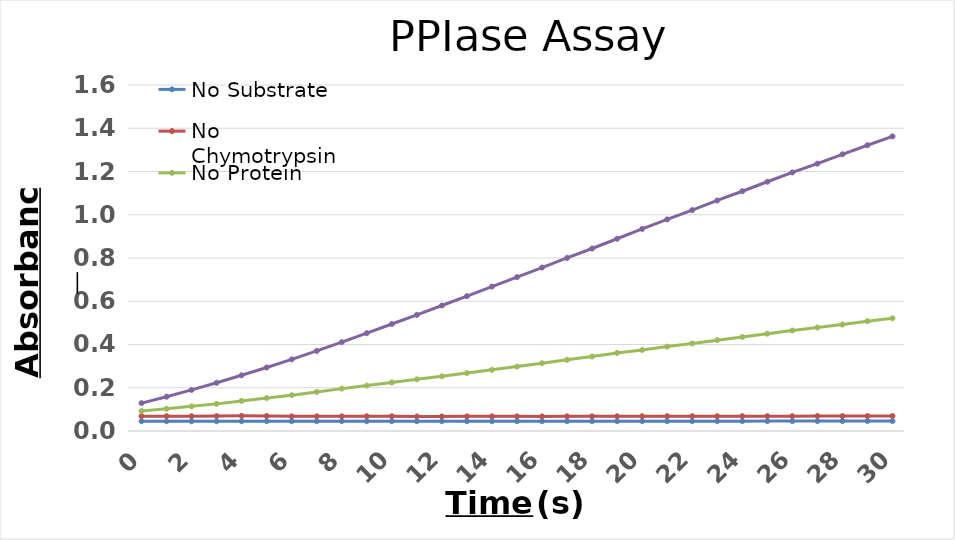
| Category | No Substrate | No Chymotrypsin | No Protein | Experimental |
|---|---|---|---|---|
| 0.0 | 0.045 | 0.068 | 0.092 | 0.129 |
| 1.0 | 0.045 | 0.069 | 0.103 | 0.159 |
| 2.0 | 0.045 | 0.069 | 0.114 | 0.19 |
| 3.0 | 0.045 | 0.069 | 0.125 | 0.223 |
| 4.0 | 0.045 | 0.07 | 0.139 | 0.258 |
| 5.0 | 0.045 | 0.069 | 0.152 | 0.294 |
| 6.0 | 0.045 | 0.068 | 0.166 | 0.331 |
| 7.0 | 0.045 | 0.068 | 0.18 | 0.37 |
| 8.0 | 0.045 | 0.068 | 0.196 | 0.411 |
| 9.0 | 0.045 | 0.068 | 0.21 | 0.452 |
| 10.0 | 0.045 | 0.068 | 0.224 | 0.495 |
| 11.0 | 0.045 | 0.067 | 0.239 | 0.537 |
| 12.0 | 0.045 | 0.068 | 0.253 | 0.58 |
| 13.0 | 0.045 | 0.068 | 0.268 | 0.623 |
| 14.0 | 0.045 | 0.068 | 0.283 | 0.668 |
| 15.0 | 0.045 | 0.068 | 0.298 | 0.712 |
| 16.0 | 0.045 | 0.068 | 0.313 | 0.756 |
| 17.0 | 0.045 | 0.068 | 0.329 | 0.8 |
| 18.0 | 0.045 | 0.068 | 0.344 | 0.844 |
| 19.0 | 0.045 | 0.068 | 0.361 | 0.889 |
| 20.0 | 0.045 | 0.068 | 0.375 | 0.934 |
| 21.0 | 0.045 | 0.069 | 0.39 | 0.978 |
| 22.0 | 0.045 | 0.068 | 0.405 | 1.022 |
| 23.0 | 0.045 | 0.069 | 0.42 | 1.066 |
| 24.0 | 0.045 | 0.069 | 0.435 | 1.109 |
| 25.0 | 0.046 | 0.069 | 0.45 | 1.153 |
| 26.0 | 0.046 | 0.069 | 0.465 | 1.196 |
| 27.0 | 0.046 | 0.069 | 0.479 | 1.236 |
| 28.0 | 0.046 | 0.069 | 0.492 | 1.279 |
| 29.0 | 0.046 | 0.069 | 0.508 | 1.321 |
| 30.0 | 0.046 | 0.069 | 0.521 | 1.362 |